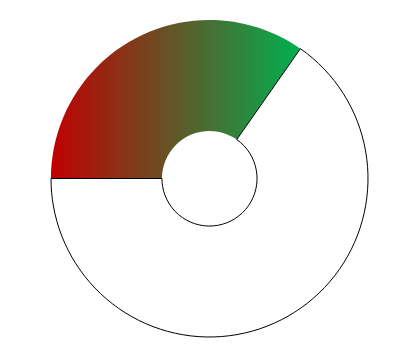
| Category | Series 0 |
|---|---|
| 0 | 125 |
| 1 | 235 |